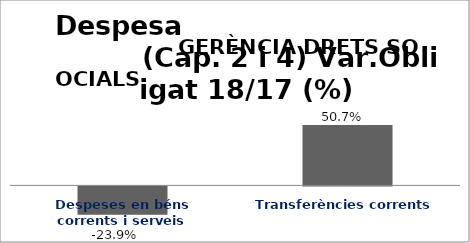
| Category | Series 0 |
|---|---|
| Despeses en béns corrents i serveis | -0.239 |
| Transferències corrents | 0.507 |